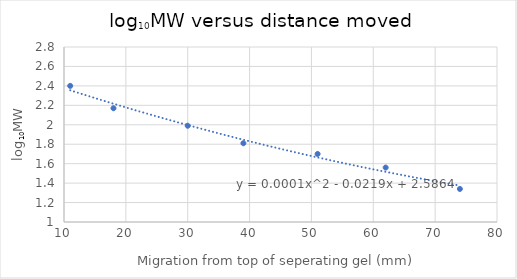
| Category | Series 0 |
|---|---|
| 11.0 | 2.4 |
| 18.0 | 2.17 |
| 30.0 | 1.99 |
| 39.0 | 1.81 |
| 51.0 | 1.7 |
| 62.0 | 1.56 |
| 74.0 | 1.34 |